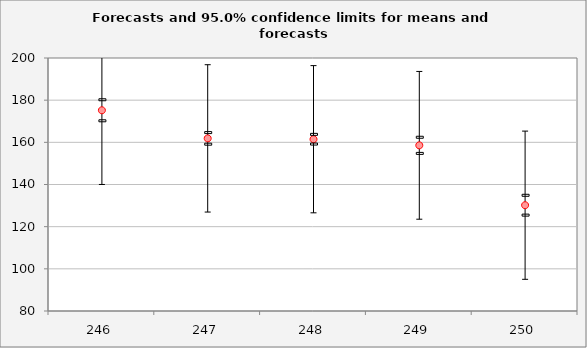
| Category | Forecast | Upper95%M | Lower95%M |
|---|---|---|---|
| 246.0 | 175.204 | 180.192 | 170.216 |
| 247.0 | 161.872 | 164.622 | 159.121 |
| 248.0 | 161.478 | 163.776 | 159.18 |
| 249.0 | 158.579 | 162.409 | 154.749 |
| 250.0 | 130.18 | 134.881 | 125.479 |